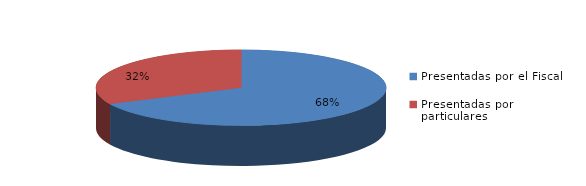
| Category | Series 0 |
|---|---|
| Presentadas por el Fiscal | 190 |
| Presentadas por particulares | 90 |